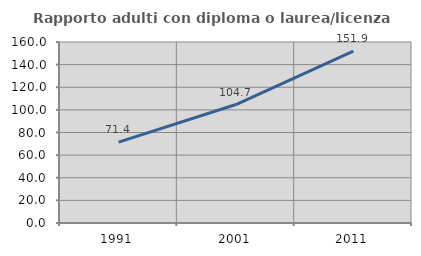
| Category | Rapporto adulti con diploma o laurea/licenza media  |
|---|---|
| 1991.0 | 71.442 |
| 2001.0 | 104.715 |
| 2011.0 | 151.871 |